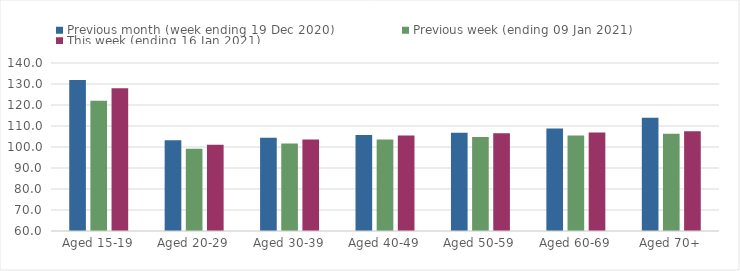
| Category | Previous month (week ending 19 Dec 2020) | Previous week (ending 09 Jan 2021) | This week (ending 16 Jan 2021) |
|---|---|---|---|
| Aged 15-19 | 131.91 | 122.05 | 127.98 |
| Aged 20-29 | 103.17 | 99.19 | 101.06 |
| Aged 30-39 | 104.42 | 101.64 | 103.53 |
| Aged 40-49 | 105.74 | 103.63 | 105.53 |
| Aged 50-59 | 106.83 | 104.76 | 106.55 |
| Aged 60-69 | 108.84 | 105.47 | 106.85 |
| Aged 70+ | 113.97 | 106.27 | 107.54 |